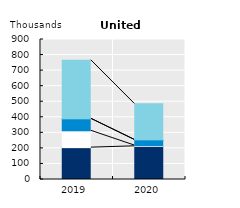
| Category | International seasonal workers | Working holidaymakers | Intra-company transferees | International trainees | Other temporary migrant workers |
|---|---|---|---|---|---|
| 2019.0 | 204.801 | 108.301 | 76.988 | 1.035 | 375.296 |
| 2020.0 | 213.394 | 4.952 | 35.942 | 0.475 | 231.534 |